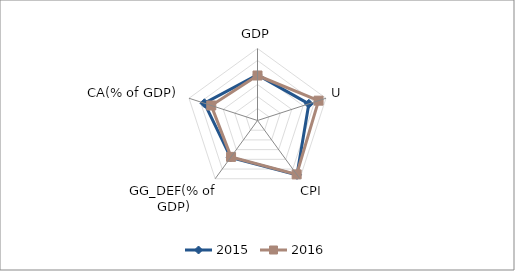
| Category | 2015 | 2016 |
|---|---|---|
| GDP | 7.6 | 7.5 |
| U | 8.996 | 10.702 |
| CPI | 11.2 | 11.1 |
| GG_DEF(% of GDP) | 7.6 | 7.5 |
| CA(% of GDP) | 9.3 | 8.1 |